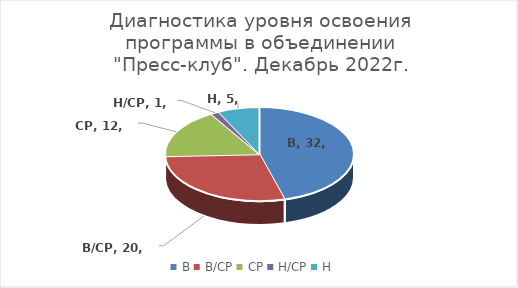
| Category | Series 0 |
|---|---|
| В | 32 |
| В/СР | 20 |
| СР | 12 |
| Н/СР | 1 |
| Н | 5 |